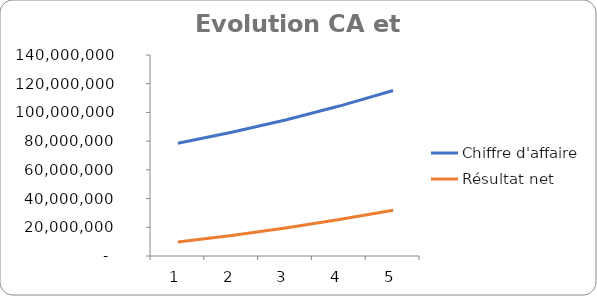
| Category | Chiffre d'affaire | Résultat net |
|---|---|---|
| 0 | 78475000 | 9699725.333 |
| 1 | 86158250 | 14333501.891 |
| 2 | 94769147.5 | 19527965.313 |
| 3 | 104429874.425 | 25350780.927 |
| 4 | 115279409.033 | 31935492.092 |